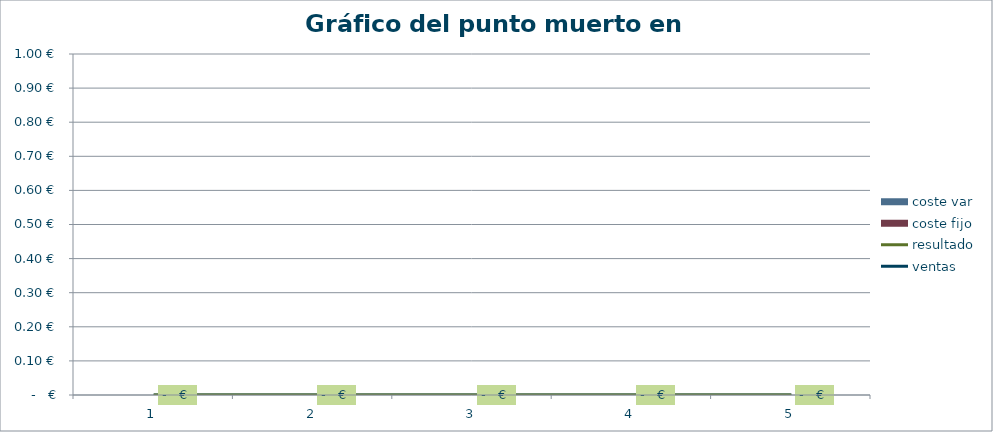
| Category | ventas | resultado |
|---|---|---|
| 1 | 0 | 0 |
| 2 | 0 | 0 |
| 3 | 0 | 0 |
| 4 | 0 | 0 |
| 5 | 0 | 0 |